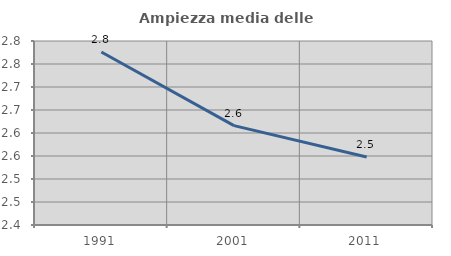
| Category | Ampiezza media delle famiglie |
|---|---|
| 1991.0 | 2.776 |
| 2001.0 | 2.616 |
| 2011.0 | 2.548 |